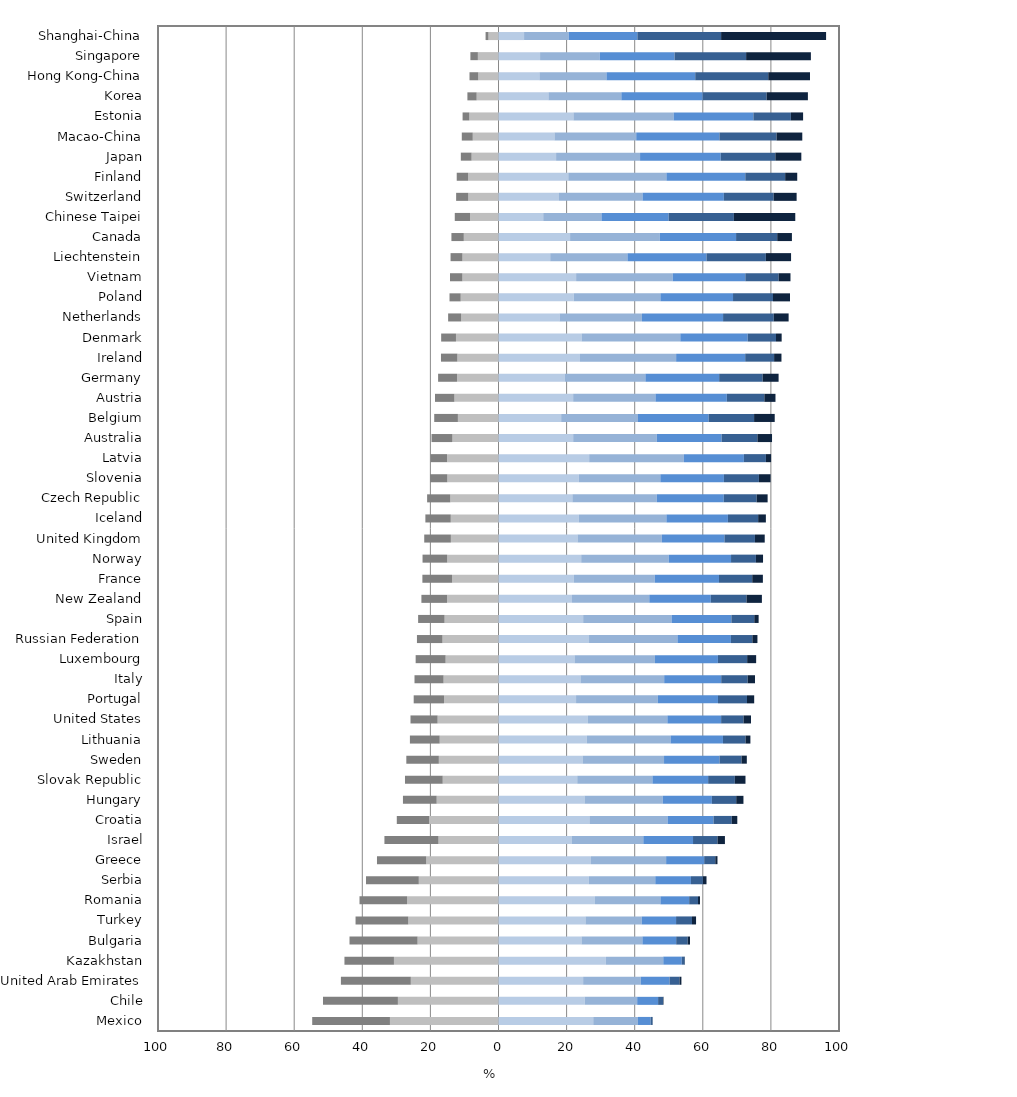
| Category | Level 1 | Below Level 1 | Level 2 | Level 3
 | Level 4
 | Level 5
 | Level 6
 |
|---|---|---|---|---|---|---|---|
| Shanghai-China | -2.947 | -0.847 | 7.51 | 13.101 | 20.172 | 24.595 | 30.828 |
| Singapore | -6.057 | -2.197 | 12.207 | 17.546 | 21.953 | 21.016 | 19.023 |
| Hong Kong-China | -5.942 | -2.575 | 12.016 | 19.694 | 26.068 | 21.448 | 12.258 |
| Korea | -6.416 | -2.717 | 14.661 | 21.414 | 23.891 | 18.774 | 12.128 |
| Estonia | -8.569 | -1.976 | 22.001 | 29.425 | 23.431 | 11.007 | 3.591 |
| Macao-China | -7.564 | -3.217 | 16.434 | 24.012 | 24.435 | 16.772 | 7.565 |
| Japan | -7.905 | -3.157 | 16.916 | 24.661 | 23.69 | 16.04 | 7.63 |
| Finland | -8.923 | -3.345 | 20.491 | 28.818 | 23.171 | 11.708 | 3.544 |
| Switzerland | -8.877 | -3.566 | 17.766 | 24.528 | 23.895 | 14.612 | 6.756 |
| Chinese Taipei | -8.343 | -4.499 | 13.136 | 17.103 | 19.72 | 19.175 | 18.026 |
| Canada | -10.192 | -3.636 | 21.026 | 26.356 | 22.393 | 12.075 | 4.322 |
| Liechtenstein | -10.59 | -3.488 | 15.187 | 22.688 | 23.203 | 17.445 | 7.399 |
| Vietnam | -10.602 | -3.647 | 22.793 | 28.362 | 21.336 | 9.783 | 3.478 |
| Poland | -11.104 | -3.283 | 22.081 | 25.462 | 21.335 | 11.74 | 4.996 |
| Netherlands | -10.965 | -3.828 | 17.927 | 24.202 | 23.826 | 14.889 | 4.362 |
| Denmark | -12.49 | -4.35 | 24.389 | 29.004 | 19.794 | 8.316 | 1.657 |
| Ireland | -12.078 | -4.818 | 23.938 | 28.231 | 20.282 | 8.49 | 2.163 |
| Germany | -12.194 | -5.545 | 19.404 | 23.735 | 21.666 | 12.774 | 4.682 |
| Austria | -12.952 | -5.703 | 21.926 | 24.167 | 20.963 | 11.022 | 3.266 |
| Belgium | -11.925 | -6.953 | 18.403 | 22.56 | 20.734 | 13.363 | 6.06 |
| Australia | -13.535 | -6.132 | 21.931 | 24.569 | 19.024 | 10.515 | 4.295 |
| Latvia | -15.12 | -4.823 | 26.629 | 27.821 | 17.619 | 6.465 | 1.522 |
| Slovenia | -15.03 | -5.057 | 23.58 | 23.949 | 18.67 | 10.282 | 3.431 |
| Czech Republic | -14.159 | -6.804 | 21.692 | 24.803 | 19.665 | 9.643 | 3.234 |
| Iceland | -14.021 | -7.455 | 23.608 | 25.698 | 18.066 | 8.885 | 2.266 |
| United Kingdom | -13.986 | -7.826 | 23.204 | 24.773 | 18.379 | 8.957 | 2.874 |
| Norway | -15.067 | -7.242 | 24.287 | 25.683 | 18.322 | 7.309 | 2.09 |
| France | -13.623 | -8.732 | 22.145 | 23.759 | 18.851 | 9.766 | 3.126 |
| New Zealand | -15.125 | -7.519 | 21.589 | 22.7 | 18.066 | 10.47 | 4.531 |
| Spain | -15.839 | -7.766 | 24.865 | 25.958 | 17.571 | 6.725 | 1.275 |
| Russian Federation | -16.453 | -7.499 | 26.587 | 25.971 | 15.699 | 6.298 | 1.492 |
| Luxembourg | -15.536 | -8.795 | 22.321 | 23.623 | 18.494 | 8.587 | 2.643 |
| Italy | -16.137 | -8.532 | 24.072 | 24.588 | 16.748 | 7.763 | 2.16 |
| Portugal | -16.013 | -8.893 | 22.778 | 24.022 | 17.66 | 8.515 | 2.119 |
| United States | -17.89 | -7.956 | 26.255 | 23.341 | 15.787 | 6.581 | 2.191 |
| Lithuania | -17.274 | -8.744 | 25.936 | 24.6 | 15.385 | 6.624 | 1.437 |
| Sweden | -17.525 | -9.547 | 24.686 | 23.929 | 16.302 | 6.458 | 1.553 |
| Slovak Republic | -16.387 | -11.077 | 23.123 | 22.086 | 16.361 | 7.842 | 3.125 |
| Hungary | -18.161 | -9.901 | 25.267 | 22.969 | 14.438 | 7.138 | 2.126 |
| Croatia | -20.37 | -9.5 | 26.706 | 22.948 | 13.492 | 5.357 | 1.628 |
| Israel | -17.63 | -15.872 | 21.575 | 20.957 | 14.599 | 7.187 | 2.18 |
| Greece | -21.235 | -14.454 | 27.156 | 22.074 | 11.178 | 3.256 | 0.646 |
| Serbia | -23.411 | -15.499 | 26.53 | 19.512 | 10.477 | 3.516 | 1.055 |
| Romania | -26.846 | -13.978 | 28.322 | 19.231 | 8.445 | 2.586 | 0.592 |
| Turkey | -26.495 | -15.485 | 25.541 | 16.523 | 10.086 | 4.671 | 1.199 |
| Bulgaria | -23.771 | -19.985 | 24.378 | 17.889 | 9.915 | 3.375 | 0.687 |
| Kazakhstan | -30.708 | -14.535 | 31.537 | 16.856 | 5.427 | 0.857 | 0.079 |
| United Arab Emirates | -25.752 | -20.532 | 24.858 | 16.896 | 8.487 | 2.926 | 0.549 |
| Chile | -29.545 | -21.997 | 25.323 | 15.403 | 6.15 | 1.452 | 0.129 |
| Mexico | -31.884 | -22.828 | 27.824 | 13.128 | 3.708 | 0.592 | 0.035 |